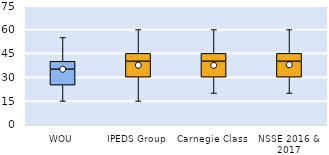
| Category | 25th | 50th | 75th |
|---|---|---|---|
| WOU | 25 | 10 | 5 |
| IPEDS Group | 30 | 10 | 5 |
| Carnegie Class | 30 | 10 | 5 |
| NSSE 2016 & 2017 | 30 | 10 | 5 |